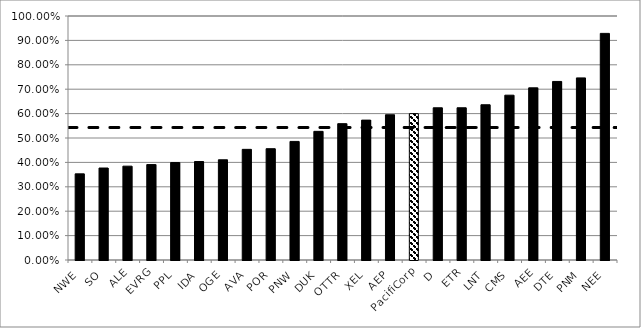
| Category | 2020-2024 |
|---|---|
| NWE | 0.353 |
| SO | 0.377 |
| ALE | 0.385 |
| EVRG | 0.391 |
| PPL | 0.4 |
| IDA | 0.404 |
| OGE | 0.411 |
| AVA | 0.453 |
| POR | 0.456 |
| PNW | 0.486 |
| DUK | 0.527 |
| OTTR | 0.559 |
| XEL | 0.573 |
| AEP | 0.595 |
| PacifiCorp | 0.6 |
| D | 0.624 |
| ETR | 0.624 |
| LNT | 0.636 |
| CMS | 0.676 |
| AEE | 0.706 |
| DTE | 0.732 |
| PNM | 0.746 |
| NEE | 0.929 |